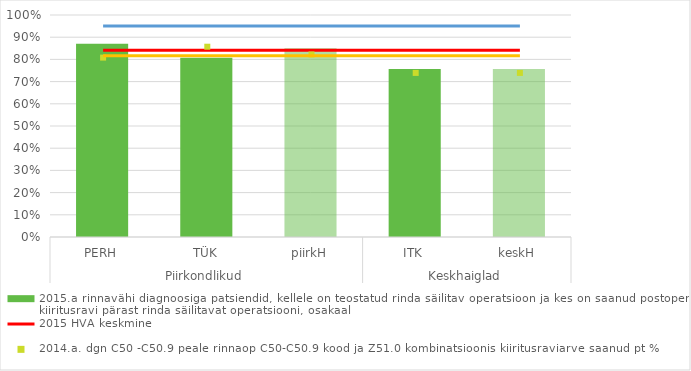
| Category | 2015.a rinnavähi diagnoosiga patsiendid, kellele on teostatud rinda säilitav operatsioon ja kes on saanud postoperatiivset kiiritusravi pärast rinda säilitavat operatsiooni, osakaal |
|---|---|
| 0 | 0.87 |
| 1 | 0.807 |
| 2 | 0.85 |
| 3 | 0.757 |
| 4 | 0.757 |